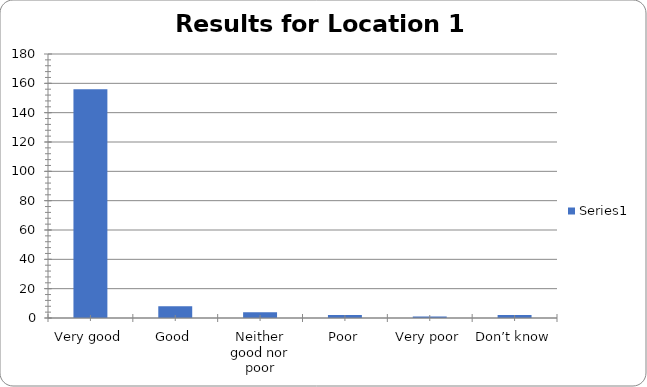
| Category | Series 0 |
|---|---|
| Very good | 156 |
| Good | 8 |
| Neither good nor poor | 4 |
| Poor | 2 |
| Very poor | 1 |
| Don’t know | 2 |